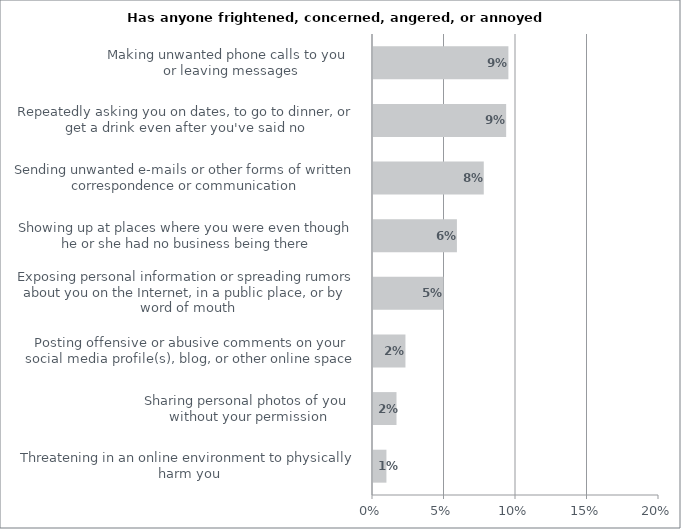
| Category | Series 0 |
|---|---|
| Threatening in an online environment to physically harm you | 0.009 |
| Sharing personal photos of you 
without your permission | 0.016 |
| Posting offensive or abusive comments on your social media profile(s), blog, or other online space | 0.023 |
| Exposing personal information or spreading rumors about you on the Internet, in a public place, or by word of mouth | 0.049 |
| Showing up at places where you were even though he or she had no business being there | 0.059 |
| Sending unwanted e-mails or other forms of written correspondence or communication | 0.077 |
| Repeatedly asking you on dates, to go to dinner, or get a drink even after you've said no | 0.093 |
| Making unwanted phone calls to you 
or leaving messages | 0.095 |